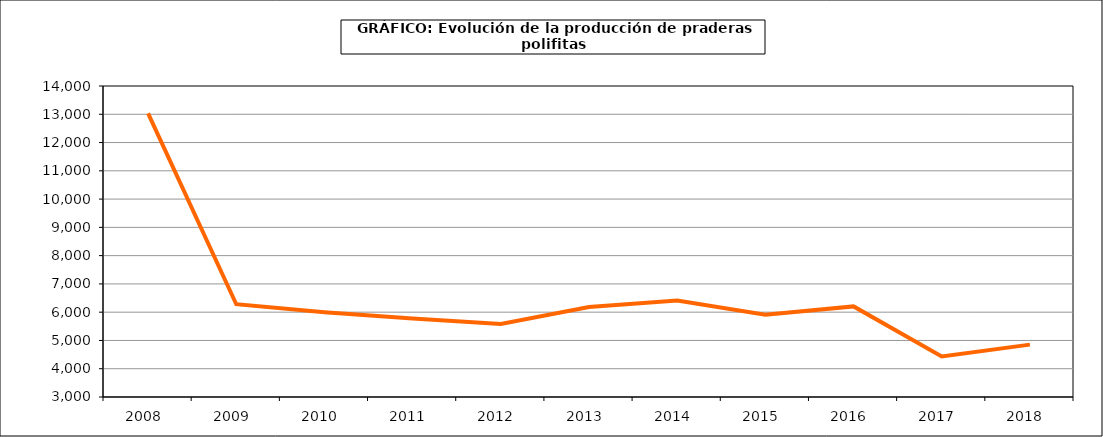
| Category | Producción |
|---|---|
| 2008.0 | 13031.127 |
| 2009.0 | 6281.816 |
| 2010.0 | 5997.652 |
| 2011.0 | 5773.366 |
| 2012.0 | 5584.28 |
| 2013.0 | 6180.164 |
| 2014.0 | 6413.135 |
| 2015.0 | 5907.876 |
| 2016.0 | 6204.083 |
| 2017.0 | 4432.964 |
| 2018.0 | 4851.915 |